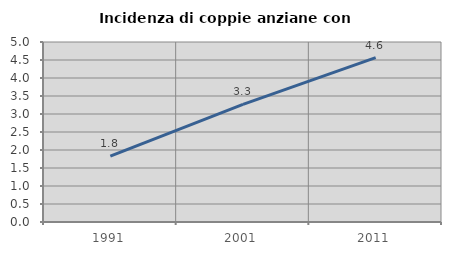
| Category | Incidenza di coppie anziane con figli |
|---|---|
| 1991.0 | 1.832 |
| 2001.0 | 3.266 |
| 2011.0 | 4.566 |